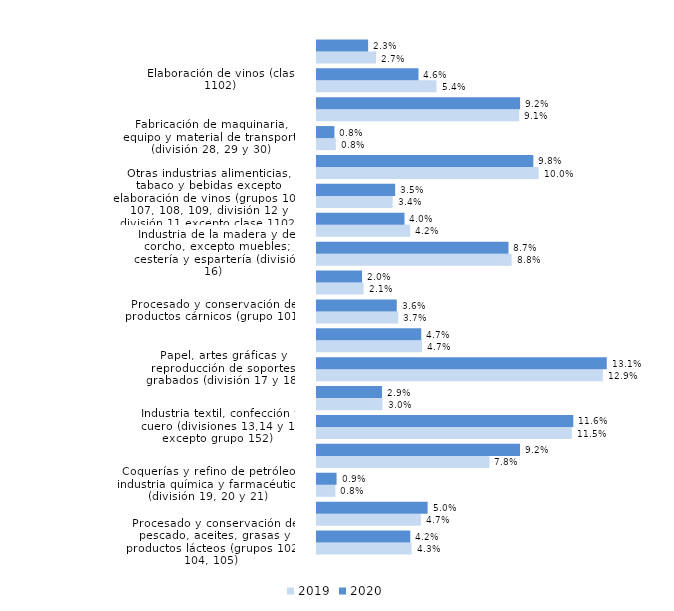
| Category | 2019 | 2020 |
|---|---|---|
| Procesado y conservación de pescado, aceites, grasas y productos lácteos (grupos 102, 104, 105) | 0.043 | 0.042 |
| Fabricación de productos informáticos, eléctricos, electrónicos y ópticos (división 26 y 27) | 0.047 | 0.05 |
| Coquerías y refino de petróleo, industria química y farmacéutica (división 19, 20 y 21) | 0.008 | 0.009 |
| Otras industrias manufactureras y reparación e instalación de maquinaria y equipo (división 32 y 33) | 0.078 | 0.092 |
| Industria textil, confección y cuero (divisiones 13,14 y 15 excepto grupo 152)  | 0.115 | 0.116 |
| Metalurgia, metales para la construcción, calderas, depósitos contenedores, armas y municiones (división 24 y grupos 251, 252, 253 y 254) | 0.03 | 0.029 |
| Papel, artes gráficas y reproducción de soportes grabados (división 17 y 18) | 0.129 | 0.131 |
| Productos minerales no metálicos diversos (división 23) | 0.047 | 0.047 |
| Procesado y conservación de productos cárnicos (grupo 101) | 0.037 | 0.036 |
| Procesado y conservación de frutas y hortalizas (grupo 103) | 0.021 | 0.02 |
| Industria de la madera y del corcho, excepto muebles; cestería y espartería (división 16) | 0.088 | 0.087 |
| Fabricación de muebles (división 31) | 0.042 | 0.04 |
| Otras industrias alimenticias, tabaco y bebidas excepto elaboración de vinos (grupos 106, 107, 108, 109, división 12 y división 11 excepto clase 1102) | 0.034 | 0.035 |
| Caucho y materias plásticas (división 22) | 0.1 | 0.098 |
| Fabricación de maquinaria, equipo y material de transporte (división 28, 29 y 30) | 0.008 | 0.008 |
| Forja, estampación, embutición, revestimiento y fabricación de otros productos metálicos (grupos 255, 256, 257, 259) | 0.091 | 0.092 |
| Elaboración de vinos (clase 1102) | 0.054 | 0.046 |
| Fabricación de calzado (grupo 152) | 0.027 | 0.023 |